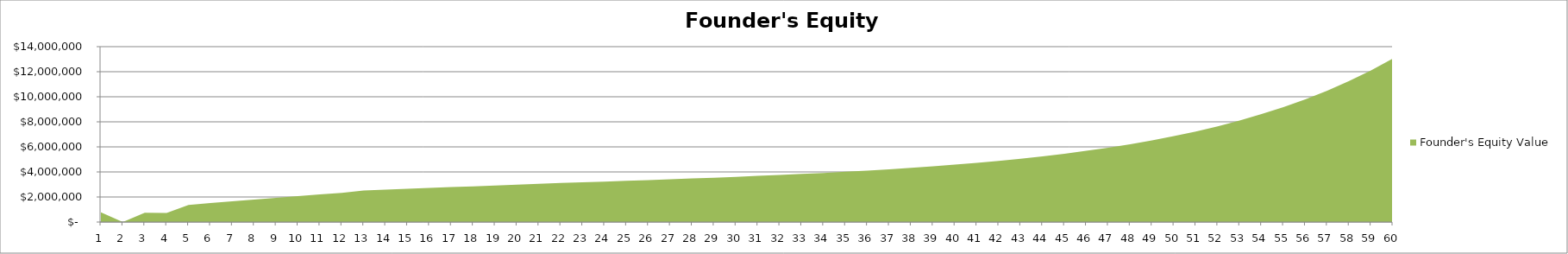
| Category | Founder's Equity Value |
|---|---|
| 0 | 774279.458 |
| 1 | 0 |
| 2 | 749839.79 |
| 3 | 719977.687 |
| 4 | 1357855.901 |
| 5 | 1512766.449 |
| 6 | 1657515.698 |
| 7 | 1798265.791 |
| 8 | 1937930.221 |
| 9 | 2071889.08 |
| 10 | 2203402.022 |
| 11 | 2331719.11 |
| 12 | 2510428.648 |
| 13 | 2577969.551 |
| 14 | 2648774.456 |
| 15 | 2717398.733 |
| 16 | 2785031.664 |
| 17 | 2851215.336 |
| 18 | 2917487.36 |
| 19 | 2984754.299 |
| 20 | 3051808.259 |
| 21 | 3113470.987 |
| 22 | 3167596.902 |
| 23 | 3227159.824 |
| 24 | 3286020.295 |
| 25 | 3347303.588 |
| 26 | 3410269.673 |
| 27 | 3474404.331 |
| 28 | 3541234.859 |
| 29 | 3609349.524 |
| 30 | 3681904.528 |
| 31 | 3756790.194 |
| 32 | 3836523.131 |
| 33 | 3922063.602 |
| 34 | 4011134.017 |
| 35 | 4108093.534 |
| 36 | 4213227.183 |
| 37 | 4325033.996 |
| 38 | 4447238.337 |
| 39 | 4580166.855 |
| 40 | 4724158.342 |
| 41 | 4883209.98 |
| 42 | 5054988.251 |
| 43 | 5245627.09 |
| 44 | 5452521.22 |
| 45 | 5682017.649 |
| 46 | 5934850.493 |
| 47 | 6212631.64 |
| 48 | 6520091.153 |
| 49 | 6859058.93 |
| 50 | 7231406.551 |
| 51 | 7646341.674 |
| 52 | 8105295.607 |
| 53 | 8613154.465 |
| 54 | 9177224.482 |
| 55 | 9796230.916 |
| 56 | 10487292.23 |
| 57 | 11253929.875 |
| 58 | 12104842.039 |
| 59 | 13051002.189 |